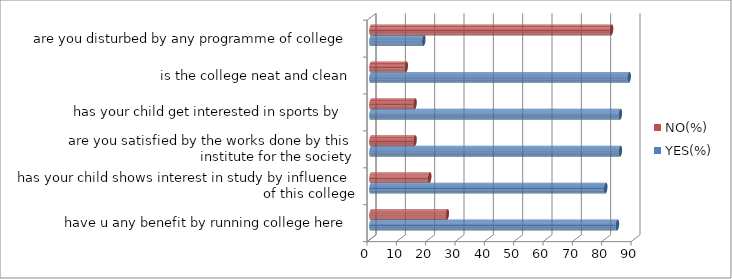
| Category | YES(%) | NO(%) |
|---|---|---|
| have u any benefit by running college here | 84 | 26 |
| has your child shows interest in study by influence of this college | 80 | 20 |
| are you satisfied by the works done by this institute for the society | 85 | 15 |
| has your child get interested in sports by  | 85 | 15 |
| is the college neat and clean | 88 | 12 |
| are you disturbed by any programme of college | 18 | 82 |